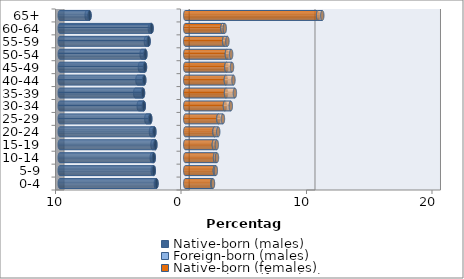
| Category | Native-born (males) | Foreign-born (males) | Native-born (females) | Foreign-born (females) |
|---|---|---|---|---|
| 0-4 | -2.294 | -0.052 | 2.161 | 0.05 |
| 5-9 | -2.508 | -0.082 | 2.36 | 0.079 |
| 10-14 | -2.51 | -0.156 | 2.375 | 0.152 |
| 15-19 | -2.383 | -0.228 | 2.28 | 0.231 |
| 20-24 | -2.463 | -0.269 | 2.335 | 0.292 |
| 25-29 | -2.789 | -0.313 | 2.644 | 0.359 |
| 30-34 | -3.303 | -0.402 | 3.162 | 0.468 |
| 35-39 | -3.367 | -0.618 | 3.251 | 0.705 |
| 40-44 | -3.269 | -0.542 | 3.237 | 0.604 |
| 45-49 | -3.21 | -0.403 | 3.277 | 0.449 |
| 50-54 | -3.179 | -0.295 | 3.319 | 0.337 |
| 55-59 | -2.923 | -0.21 | 3.107 | 0.255 |
| 60-64 | -2.684 | -0.135 | 2.969 | 0.179 |
| 65+ | -7.629 | -0.227 | 10.586 | 0.333 |